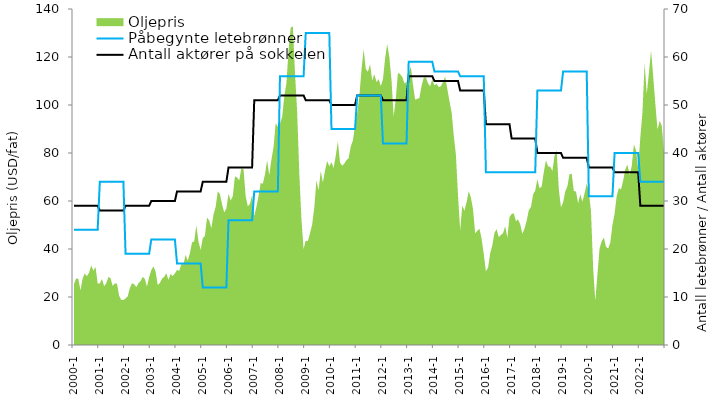
| Category | Antall aktører på sokkelen | Påbegynte letebrønner |
|---|---|---|
| 2000-1 | 29 | 24 |
| 2000-2 | 29 | 24 |
| 2000-3 | 29 | 24 |
| 2000-4 | 29 | 24 |
| 2000-5 | 29 | 24 |
| 2000-6 | 29 | 24 |
| 2000-7 | 29 | 24 |
| 2000-8 | 29 | 24 |
| 2000-9 | 29 | 24 |
| 2000-10 | 29 | 24 |
| 2000-11 | 29 | 24 |
| 2000-12 | 29 | 24 |
| 2001-1 | 28 | 34 |
| 2001-2 | 28 | 34 |
| 2001-3 | 28 | 34 |
| 2001-4 | 28 | 34 |
| 2001-5 | 28 | 34 |
| 2001-6 | 28 | 34 |
| 2001-7 | 28 | 34 |
| 2001-8 | 28 | 34 |
| 2001-9 | 28 | 34 |
| 2001-10 | 28 | 34 |
| 2001-11 | 28 | 34 |
| 2001-12 | 28 | 34 |
| 2002-1 | 29 | 19 |
| 2002-2 | 29 | 19 |
| 2002-3 | 29 | 19 |
| 2002-4 | 29 | 19 |
| 2002-5 | 29 | 19 |
| 2002-6 | 29 | 19 |
| 2002-7 | 29 | 19 |
| 2002-8 | 29 | 19 |
| 2002-9 | 29 | 19 |
| 2002-10 | 29 | 19 |
| 2002-11 | 29 | 19 |
| 2002-12 | 29 | 19 |
| 2003-1 | 30 | 22 |
| 2003-2 | 30 | 22 |
| 2003-3 | 30 | 22 |
| 2003-4 | 30 | 22 |
| 2003-5 | 30 | 22 |
| 2003-6 | 30 | 22 |
| 2003-7 | 30 | 22 |
| 2003-8 | 30 | 22 |
| 2003-9 | 30 | 22 |
| 2003-10 | 30 | 22 |
| 2003-11 | 30 | 22 |
| 2003-12 | 30 | 22 |
| 2004-1 | 32 | 17 |
| 2004-2 | 32 | 17 |
| 2004-3 | 32 | 17 |
| 2004-4 | 32 | 17 |
| 2004-5 | 32 | 17 |
| 2004-6 | 32 | 17 |
| 2004-7 | 32 | 17 |
| 2004-8 | 32 | 17 |
| 2004-9 | 32 | 17 |
| 2004-10 | 32 | 17 |
| 2004-11 | 32 | 17 |
| 2004-12 | 32 | 17 |
| 2005-1 | 34 | 12 |
| 2005-2 | 34 | 12 |
| 2005-3 | 34 | 12 |
| 2005-4 | 34 | 12 |
| 2005-5 | 34 | 12 |
| 2005-6 | 34 | 12 |
| 2005-7 | 34 | 12 |
| 2005-8 | 34 | 12 |
| 2005-9 | 34 | 12 |
| 2005-10 | 34 | 12 |
| 2005-11 | 34 | 12 |
| 2005-12 | 34 | 12 |
| 2006-1 | 37 | 26 |
| 2006-2 | 37 | 26 |
| 2006-3 | 37 | 26 |
| 2006-4 | 37 | 26 |
| 2006-5 | 37 | 26 |
| 2006-6 | 37 | 26 |
| 2006-7 | 37 | 26 |
| 2006-8 | 37 | 26 |
| 2006-9 | 37 | 26 |
| 2006-10 | 37 | 26 |
| 2006-11 | 37 | 26 |
| 2006-12 | 37 | 26 |
| 2007-1 | 51 | 32 |
| 2007-2 | 51 | 32 |
| 2007-3 | 51 | 32 |
| 2007-4 | 51 | 32 |
| 2007-5 | 51 | 32 |
| 2007-6 | 51 | 32 |
| 2007-7 | 51 | 32 |
| 2007-8 | 51 | 32 |
| 2007-9 | 51 | 32 |
| 2007-10 | 51 | 32 |
| 2007-11 | 51 | 32 |
| 2007-12 | 51 | 32 |
| 2008-1 | 52 | 56 |
| 2008-2 | 52 | 56 |
| 2008-3 | 52 | 56 |
| 2008-4 | 52 | 56 |
| 2008-5 | 52 | 56 |
| 2008-6 | 52 | 56 |
| 2008-7 | 52 | 56 |
| 2008-8 | 52 | 56 |
| 2008-9 | 52 | 56 |
| 2008-10 | 52 | 56 |
| 2008-11 | 52 | 56 |
| 2008-12 | 52 | 56 |
| 2009-1 | 51 | 65 |
| 2009-2 | 51 | 65 |
| 2009-3 | 51 | 65 |
| 2009-4 | 51 | 65 |
| 2009-5 | 51 | 65 |
| 2009-6 | 51 | 65 |
| 2009-7 | 51 | 65 |
| 2009-8 | 51 | 65 |
| 2009-9 | 51 | 65 |
| 2009-10 | 51 | 65 |
| 2009-11 | 51 | 65 |
| 2009-12 | 51 | 65 |
| 2010-1 | 50 | 45 |
| 2010-2 | 50 | 45 |
| 2010-3 | 50 | 45 |
| 2010-4 | 50 | 45 |
| 2010-5 | 50 | 45 |
| 2010-6 | 50 | 45 |
| 2010-7 | 50 | 45 |
| 2010-8 | 50 | 45 |
| 2010-9 | 50 | 45 |
| 2010-10 | 50 | 45 |
| 2010-11 | 50 | 45 |
| 2010-12 | 50 | 45 |
| 2011-1 | 52 | 52 |
| 2011-2 | 52 | 52 |
| 2011-3 | 52 | 52 |
| 2011-4 | 52 | 52 |
| 2011-5 | 52 | 52 |
| 2011-6 | 52 | 52 |
| 2011-7 | 52 | 52 |
| 2011-8 | 52 | 52 |
| 2011-9 | 52 | 52 |
| 2011-10 | 52 | 52 |
| 2011-11 | 52 | 52 |
| 2011-12 | 52 | 52 |
| 2012-1 | 51 | 42 |
| 2012-2 | 51 | 42 |
| 2012-3 | 51 | 42 |
| 2012-4 | 51 | 42 |
| 2012-5 | 51 | 42 |
| 2012-6 | 51 | 42 |
| 2012-7 | 51 | 42 |
| 2012-8 | 51 | 42 |
| 2012-9 | 51 | 42 |
| 2012-10 | 51 | 42 |
| 2012-11 | 51 | 42 |
| 2012-12 | 51 | 42 |
| 2013-1 | 56 | 59 |
| 2013-2 | 56 | 59 |
| 2013-3 | 56 | 59 |
| 2013-4 | 56 | 59 |
| 2013-5 | 56 | 59 |
| 2013-6 | 56 | 59 |
| 2013-7 | 56 | 59 |
| 2013-8 | 56 | 59 |
| 2013-9 | 56 | 59 |
| 2013-10 | 56 | 59 |
| 2013-11 | 56 | 59 |
| 2013-12 | 56 | 59 |
| 2014-1 | 55 | 57 |
| 2014-2 | 55 | 57 |
| 2014-3 | 55 | 57 |
| 2014-4 | 55 | 57 |
| 2014-5 | 55 | 57 |
| 2014-6 | 55 | 57 |
| 2014-7 | 55 | 57 |
| 2014-8 | 55 | 57 |
| 2014-9 | 55 | 57 |
| 2014-10 | 55 | 57 |
| 2014-11 | 55 | 57 |
| 2014-12 | 55 | 57 |
| 2015-1 | 53 | 56 |
| 2015-2 | 53 | 56 |
| 2015-3 | 53 | 56 |
| 2015-4 | 53 | 56 |
| 2015-5 | 53 | 56 |
| 2015-6 | 53 | 56 |
| 2015-7 | 53 | 56 |
| 2015-8 | 53 | 56 |
| 2015-9 | 53 | 56 |
| 2015-10 | 53 | 56 |
| 2015-11 | 53 | 56 |
| 2015-12 | 53 | 56 |
| 2016-1 | 46 | 36 |
| 2016-2 | 46 | 36 |
| 2016-3 | 46 | 36 |
| 2016-4 | 46 | 36 |
| 2016-5 | 46 | 36 |
| 2016-6 | 46 | 36 |
| 2016-7 | 46 | 36 |
| 2016-8 | 46 | 36 |
| 2016-9 | 46 | 36 |
| 2016-10 | 46 | 36 |
| 2016-11 | 46 | 36 |
| 2016-12 | 46 | 36 |
| 2017-1 | 43 | 36 |
| 2017-2 | 43 | 36 |
| 2017-3 | 43 | 36 |
| 2017-4 | 43 | 36 |
| 2017-5 | 43 | 36 |
| 2017-6 | 43 | 36 |
| 2017-7 | 43 | 36 |
| 2017-8 | 43 | 36 |
| 2017-9 | 43 | 36 |
| 2017-10 | 43 | 36 |
| 2017-11 | 43 | 36 |
| 2017-12 | 43 | 36 |
| 2018-1 | 40 | 53 |
| 2018-2 | 40 | 53 |
| 2018-3 | 40 | 53 |
| 2018-4 | 40 | 53 |
| 2018-5 | 40 | 53 |
| 2018-6 | 40 | 53 |
| 2018-7 | 40 | 53 |
| 2018-8 | 40 | 53 |
| 2018-9 | 40 | 53 |
| 2018-10 | 40 | 53 |
| 2018-11 | 40 | 53 |
| 2018-12 | 40 | 53 |
| 2019-1 | 39 | 57 |
| 2019-2 | 39 | 57 |
| 2019-3 | 39 | 57 |
| 2019-4 | 39 | 57 |
| 2019-5 | 39 | 57 |
| 2019-6 | 39 | 57 |
| 2019-7 | 39 | 57 |
| 2019-8 | 39 | 57 |
| 2019-9 | 39 | 57 |
| 2019-10 | 39 | 57 |
| 2019-11 | 39 | 57 |
| 2019-12 | 39 | 57 |
| 2020-1 | 37 | 31 |
| 2020-2 | 37 | 31 |
| 2020-3 | 37 | 31 |
| 2020-4 | 37 | 31 |
| 2020-5 | 37 | 31 |
| 2020-6 | 37 | 31 |
| 2020-7 | 37 | 31 |
| 2020-8 | 37 | 31 |
| 2020-9 | 37 | 31 |
| 2020-10 | 37 | 31 |
| 2020-11 | 37 | 31 |
| 2020-12 | 37 | 31 |
| 2021-1 | 36 | 40 |
| 2021-2 | 36 | 40 |
| 2021-3 | 36 | 40 |
| 2021-4 | 36 | 40 |
| 2021-5 | 36 | 40 |
| 2021-6 | 36 | 40 |
| 2021-7 | 36 | 40 |
| 2021-8 | 36 | 40 |
| 2021-9 | 36 | 40 |
| 2021-10 | 36 | 40 |
| 2021-11 | 36 | 40 |
| 2021-12 | 36 | 40 |
| 2022-1 | 29 | 34 |
| 2022-2 | 29 | 34 |
| 2022-3 | 29 | 34 |
| 2022-4 | 29 | 34 |
| 2022-5 | 29 | 34 |
| 2022-6 | 29 | 34 |
| 2022-7 | 29 | 34 |
| 2022-8 | 29 | 34 |
| 2022-9 | 29 | 34 |
| 2022-10 | 29 | 34 |
| 2022-11 | 29 | 34 |
| 2022-12 | 29 | 34 |